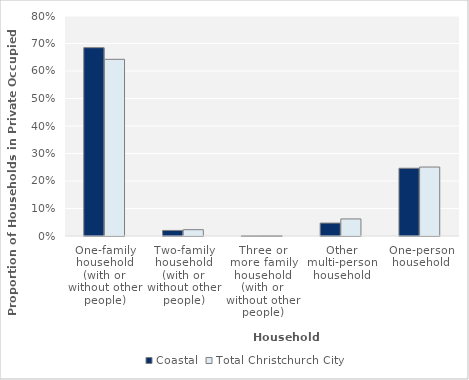
| Category | Coastal | Total Christchurch City |
|---|---|---|
| One-family household (with or without other people) | 0.685 |  |
| Two-family household (with or without other people) | 0.02 |  |
| Three or more family household (with or without other people) | 0.001 |  |
| Other multi-person household | 0.047 |  |
| One-person household | 0.246 |  |